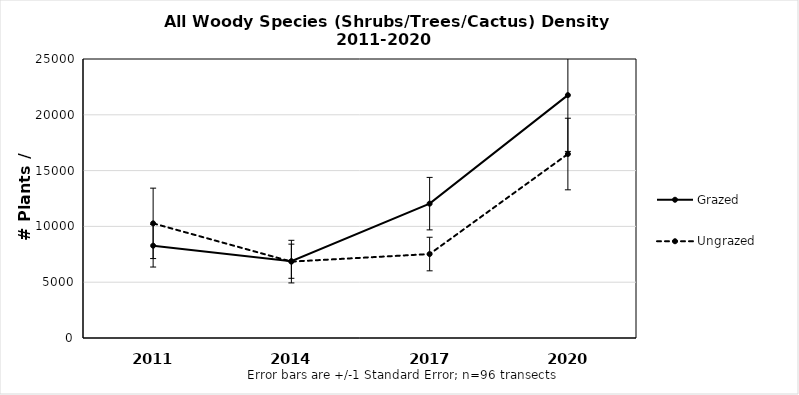
| Category | Grazed | Ungrazed |
|---|---|---|
| 2011.0 | 8271.823 | 10272.505 |
| 2014.0 | 6879.536 | 6844.436 |
| 2017.0 | 12039.188 | 7523.03 |
| 2020.0 | 21761.798 | 16485.147 |